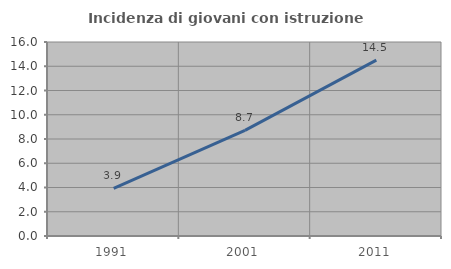
| Category | Incidenza di giovani con istruzione universitaria |
|---|---|
| 1991.0 | 3.922 |
| 2001.0 | 8.711 |
| 2011.0 | 14.511 |